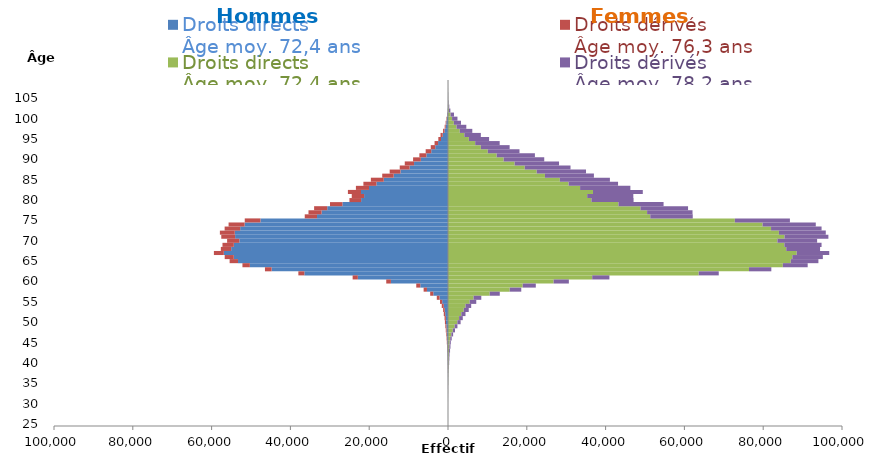
| Category | Droits directs
Âge moy. 72,4 ans | Droits dérivés
Âge moy. 76,3 ans | Droits dérivés
Âge moy. 78,2 ans |
|---|---|---|---|
| 25.0 | 0 | 0 | 0 |
| 26.0 | 1 | 0 | 1 |
| 27.0 | 0 | 0 | 1 |
| 28.0 | 0 | -1 | 0 |
| 29.0 | 1 | 0 | 5 |
| 30.0 | 4 | 0 | 5 |
| 31.0 | 6 | -2 | 9 |
| 32.0 | 10 | -3 | 16 |
| 33.0 | 25 | -6 | 21 |
| 34.0 | 16 | -12 | 26 |
| 35.0 | 49 | -13 | 40 |
| 36.0 | 54 | -8 | 43 |
| 37.0 | 68 | -16 | 56 |
| 38.0 | 95 | -28 | 70 |
| 39.0 | 121 | -36 | 93 |
| 40.0 | 172 | -36 | 124 |
| 41.0 | 186 | -59 | 157 |
| 42.0 | 221 | -51 | 169 |
| 43.0 | 273 | -83 | 245 |
| 44.0 | 337 | -103 | 287 |
| 45.0 | 405 | -120 | 307 |
| 46.0 | 560 | -134 | 384 |
| 47.0 | 852 | -166 | 447 |
| 48.0 | 1205 | -206 | 576 |
| 49.0 | 1693 | -263 | 700 |
| 50.0 | 2378 | -276 | 824 |
| 51.0 | 2817 | -330 | 936 |
| 52.0 | 3382 | -361 | 1060 |
| 53.0 | 3980 | -412 | 1281 |
| 54.0 | 4445 | -510 | 1441 |
| 55.0 | 5500 | -550 | 1672 |
| 56.0 | 6489 | -696 | 1962 |
| 57.0 | 10586 | -791 | 2558 |
| 58.0 | 15660 | -847 | 2937 |
| 59.0 | 18967 | -1020 | 3316 |
| 60.0 | 26807 | -1185 | 3867 |
| 61.0 | 36602 | -1320 | 4365 |
| 62.0 | 63632 | -1519 | 5086 |
| 63.0 | 76393 | -1684 | 5670 |
| 64.0 | 84981 | -1884 | 6309 |
| 65.0 | 86997 | -2129 | 7015 |
| 66.0 | 87397 | -2307 | 7740 |
| 67.0 | 88502 | -2514 | 8260 |
| 68.0 | 85850 | -2621 | 8587 |
| 69.0 | 85372 | -2880 | 9438 |
| 70.0 | 83602 | -3102 | 10085 |
| 71.0 | 85402 | -3508 | 11143 |
| 72.0 | 83989 | -3780 | 11895 |
| 73.0 | 81992 | -3941 | 12824 |
| 74.0 | 79835 | -4063 | 13511 |
| 75.0 | 72802 | -3982 | 13976 |
| 76.0 | 51337 | -3118 | 10782 |
| 77.0 | 50534 | -3327 | 11526 |
| 78.0 | 48847 | -3325 | 12080 |
| 79.0 | 43254 | -3155 | 11460 |
| 80.0 | 36393 | -2968 | 10706 |
| 81.0 | 35327 | -3130 | 11708 |
| 82.0 | 36800 | -3320 | 12640 |
| 83.0 | 33526 | -3323 | 12761 |
| 84.0 | 30611 | -3301 | 12551 |
| 85.0 | 28388 | -3275 | 12703 |
| 86.0 | 24609 | -2907 | 12423 |
| 87.0 | 22517 | -2741 | 12511 |
| 88.0 | 19483 | -2505 | 11614 |
| 89.0 | 16911 | -2357 | 11272 |
| 90.0 | 14120 | -1971 | 10307 |
| 91.0 | 12351 | -1776 | 9707 |
| 92.0 | 10104 | -1405 | 8043 |
| 93.0 | 8342 | -1134 | 7302 |
| 94.0 | 6900 | -889 | 6218 |
| 95.0 | 5296 | -670 | 5134 |
| 96.0 | 4147 | -553 | 4188 |
| 97.0 | 2981 | -366 | 3188 |
| 98.0 | 2167 | -248 | 2481 |
| 99.0 | 1483 | -166 | 1824 |
| 100.0 | 1033 | -121 | 1368 |
| 101.0 | 653 | -70 | 877 |
| 102.0 | 233 | -30 | 366 |
| 103.0 | 131 | -12 | 198 |
| 104.0 | 69 | -4 | 113 |
| 105.0 | 41 | -2 | 46 |
| 106.0 | 32 | -1 | 44 |
| 107.0 | 17 | -1 | 16 |
| 108.0 | 8 | 0 | 13 |
| 109.0 | 9 | 0 | 9 |